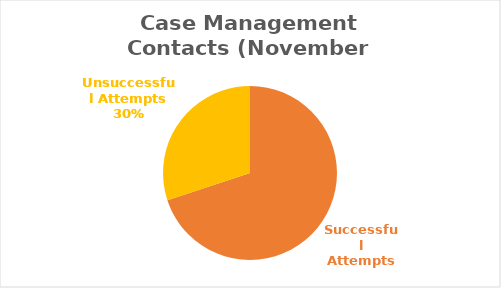
| Category | Series 0 |
|---|---|
| Successful Attempts | 193 |
| Unsuccessful Attempts | 83 |